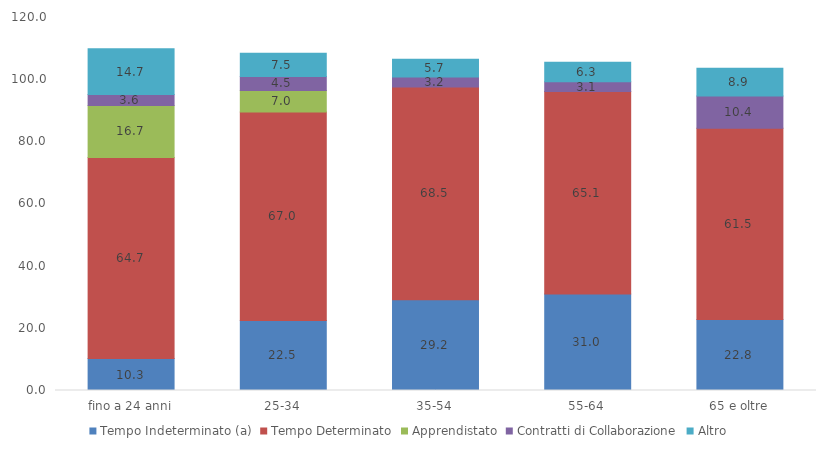
| Category | Tempo Indeterminato (a) | Tempo Determinato | Apprendistato | Contratti di Collaborazione | Altro  |
|---|---|---|---|---|---|
| fino a 24 anni | 10.267 | 64.726 | 16.679 | 3.571 | 14.724 |
| 25-34 | 22.536 | 67.029 | 6.987 | 4.482 | 7.458 |
| 35-54 | 29.157 | 68.454 | 0 | 3.248 | 5.695 |
| 55-64 | 31.047 | 65.128 | 0 | 3.15 | 6.262 |
| 65 e oltre | 22.842 | 61.498 | 0 | 10.43 | 8.896 |